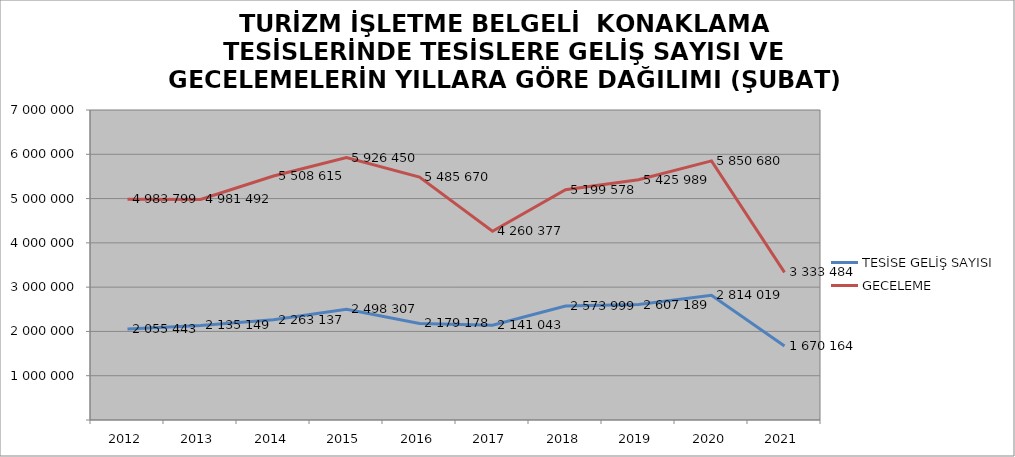
| Category | TESİSE GELİŞ SAYISI | GECELEME |
|---|---|---|
| 2012 | 2055443 | 4983799 |
| 2013 | 2135149 | 4981492 |
| 2014 | 2263137 | 5508615 |
| 2015 | 2498307 | 5926450 |
| 2016 | 2179178 | 5485670 |
| 2017 | 2141043 | 4260377 |
| 2018 | 2573999 | 5199578 |
| 2019 | 2607189 | 5425989 |
| 2020 | 2814019 | 5850680 |
| 2021 | 1670164 | 3333484 |